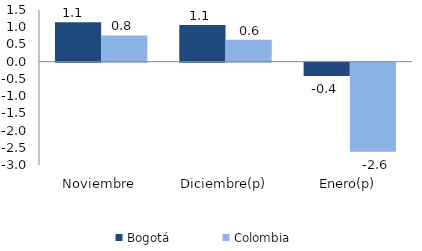
| Category | Bogotá | Colombia |
|---|---|---|
| Noviembre | 1.141 | 0.763 |
| Diciembre(p) | 1.064 | 0.638 |
| Enero(p) | -0.386 | -2.586 |